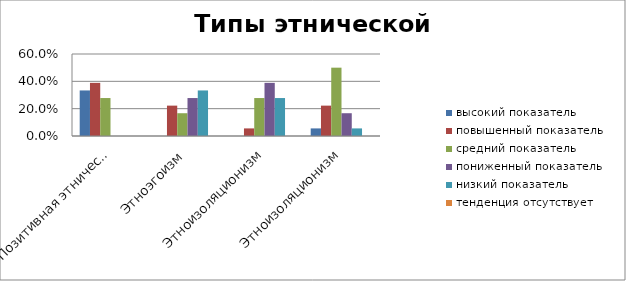
| Category | высокий показатель | повышенный показатель | средний показатель | пониженный показатель | низкий показатель | тенденция отсутствует |
|---|---|---|---|---|---|---|
| Позитивная этническая идентичность | 0.333 | 0.389 | 0.278 | 0 | 0 | 0 |
| Этноэгоизм | 0 | 0.222 | 0.167 | 0.278 | 0.333 | 0 |
| Этноизоляционизм | 0 | 0.056 | 0.278 | 0.389 | 0.278 | 0 |
| Этноизоляционизм | 0.056 | 0.222 | 0.5 | 0.167 | 0.056 | 0 |